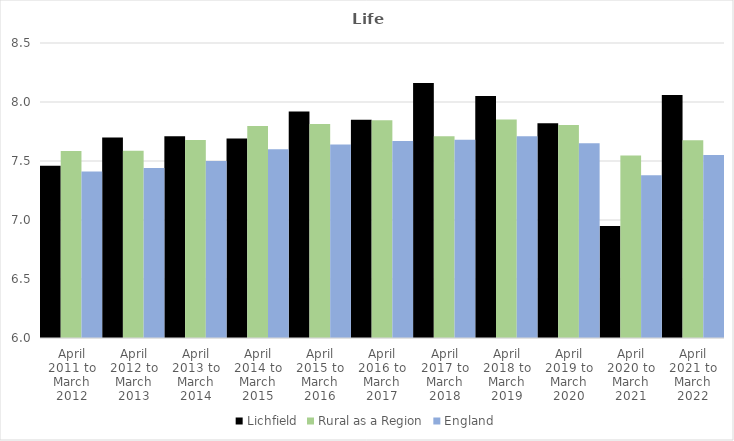
| Category | Lichfield | Rural as a Region | England |
|---|---|---|---|
| April 2011 to March 2012 | 7.46 | 7.584 | 7.41 |
| April 2012 to March 2013 | 7.7 | 7.586 | 7.44 |
| April 2013 to March 2014 | 7.71 | 7.677 | 7.5 |
| April 2014 to March 2015 | 7.69 | 7.797 | 7.6 |
| April 2015 to March 2016 | 7.92 | 7.813 | 7.64 |
| April 2016 to March 2017 | 7.85 | 7.845 | 7.67 |
| April 2017 to March 2018 | 8.16 | 7.71 | 7.68 |
| April 2018 to March 2019 | 8.05 | 7.852 | 7.71 |
| April 2019 to March 2020 | 7.82 | 7.806 | 7.65 |
| April 2020 to March 2021 | 6.95 | 7.546 | 7.38 |
| April 2021 to March 2022 | 8.06 | 7.677 | 7.55 |